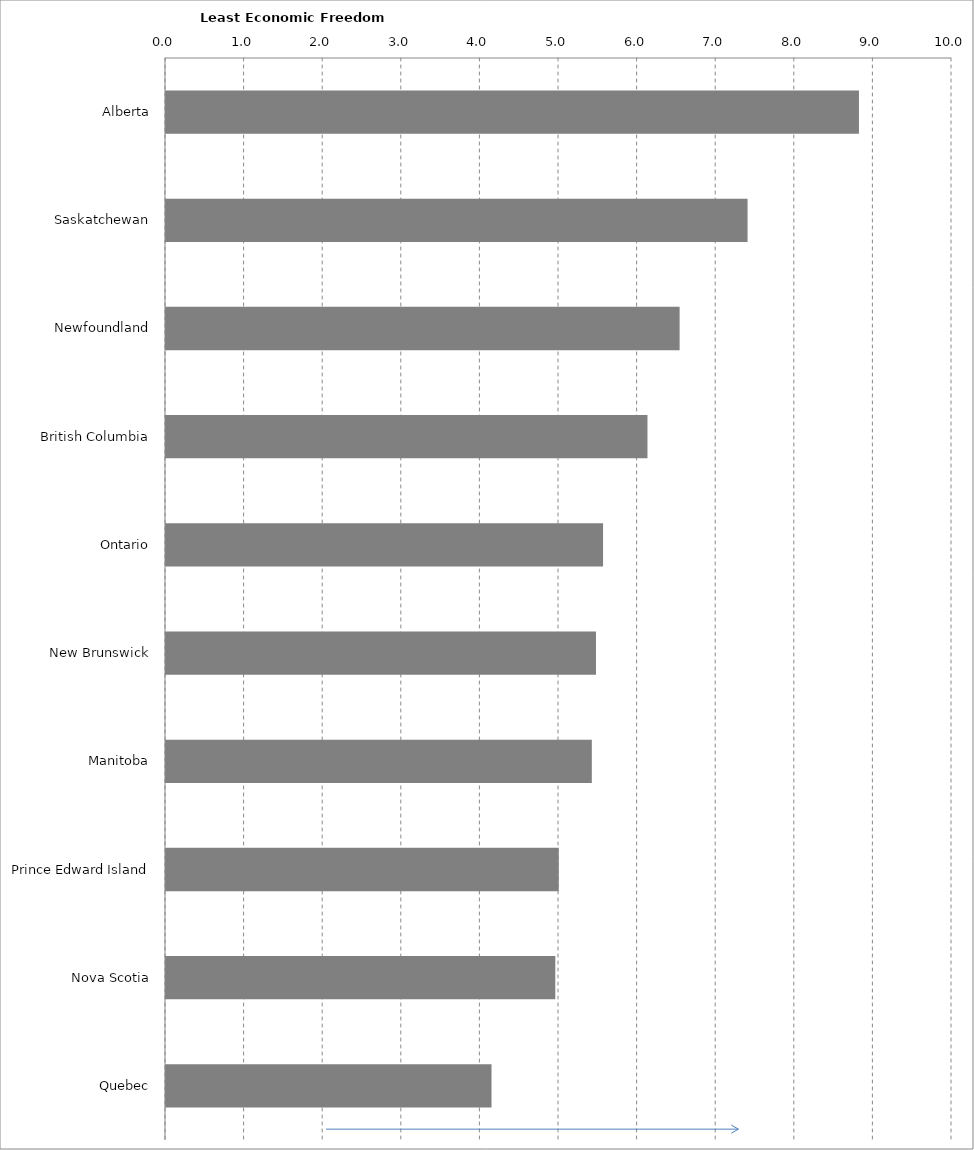
| Category | Series 0 |
|---|---|
| Alberta | 8.816 |
| Saskatchewan | 7.399 |
| Newfoundland | 6.535 |
| British Columbia | 6.125 |
| Ontario | 5.561 |
| New Brunswick | 5.471 |
| Manitoba | 5.418 |
| Prince Edward Island | 4.997 |
| Nova Scotia | 4.953 |
| Quebec | 4.141 |